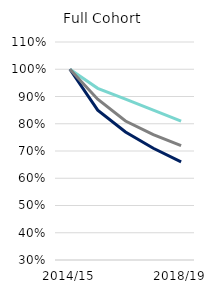
| Category | UK and RoI | EEA | Non-EEA |
|---|---|---|---|
| 2014/15 | 1 | 1 | 1 |
| 2015/16 | 0.93 | 0.85 | 0.89 |
| 2016/16 | 0.89 | 0.77 | 0.81 |
| 2017/18 | 0.85 | 0.71 | 0.76 |
| 2018/19 | 0.81 | 0.66 | 0.72 |